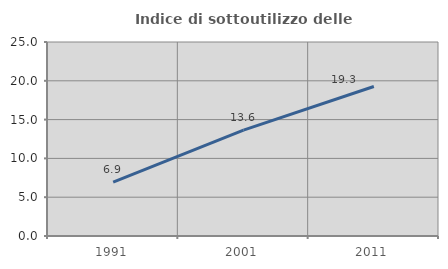
| Category | Indice di sottoutilizzo delle abitazioni  |
|---|---|
| 1991.0 | 6.93 |
| 2001.0 | 13.647 |
| 2011.0 | 19.262 |